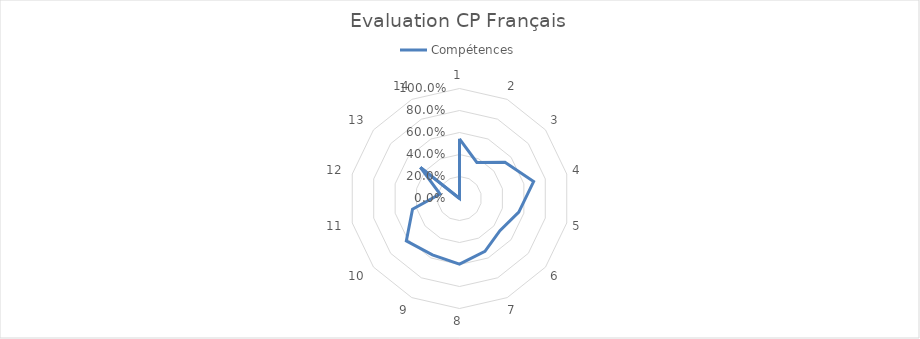
| Category | Compétences |
|---|---|
| 0 | 0.543 |
| 1 | 0.364 |
| 2 | 0.529 |
| 3 | 0.691 |
| 4 | 0.553 |
| 5 | 0.47 |
| 6 | 0.533 |
| 7 | 0.596 |
| 8 | 0.568 |
| 9 | 0.618 |
| 10 | 0.438 |
| 11 | 0.182 |
| 12 | 0.455 |
| 13 | 0 |